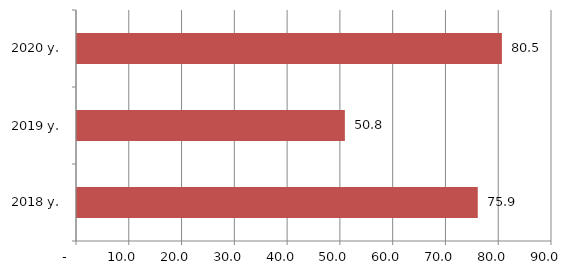
| Category | Series 0 |
|---|---|
| 2018 y. | 75.935 |
| 2019 y. | 50.753 |
| 2020 y. | 80.512 |